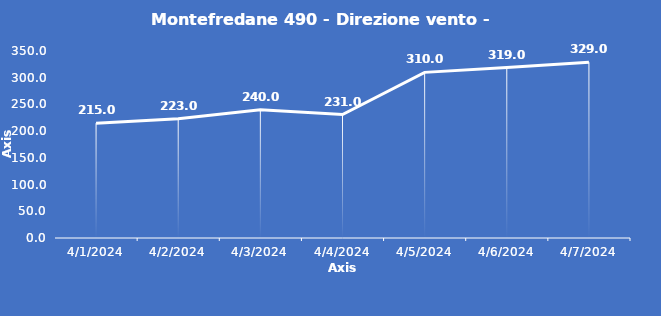
| Category | Montefredane 490 - Direzione vento - Grezzo (°N) |
|---|---|
| 4/1/24 | 215 |
| 4/2/24 | 223 |
| 4/3/24 | 240 |
| 4/4/24 | 231 |
| 4/5/24 | 310 |
| 4/6/24 | 319 |
| 4/7/24 | 329 |